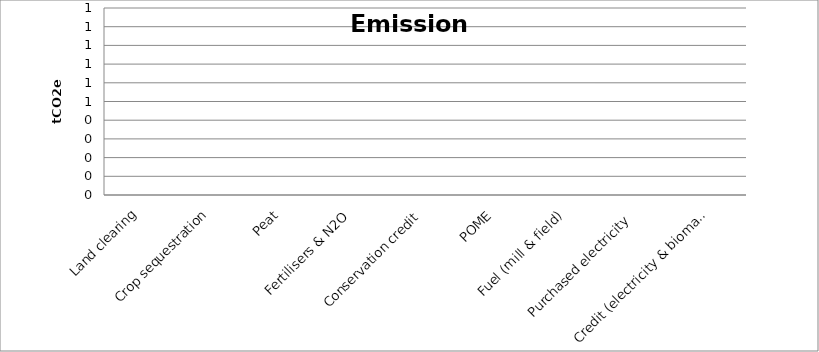
| Category | tCO2e |
|---|---|
| Land clearing | 0 |
| Crop sequestration | 0 |
| Peat  | 0 |
| Fertilisers & N2O | 0 |
| Conservation credit | 0 |
| POME | 0 |
| Fuel (mill & field) | 0 |
| Purchased electricity  | 0 |
| Credit (electricity & biomass) | 0 |